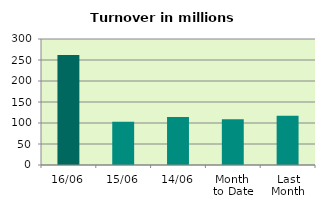
| Category | Series 0 |
|---|---|
| 16/06 | 261.905 |
| 15/06 | 102.915 |
| 14/06 | 114.137 |
| Month 
to Date | 108.71 |
| Last
Month | 117.306 |